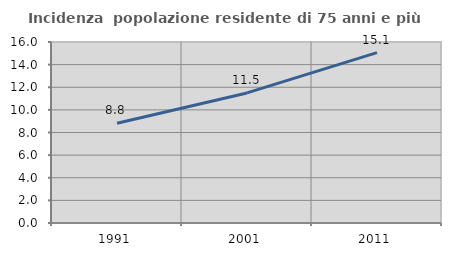
| Category | Incidenza  popolazione residente di 75 anni e più |
|---|---|
| 1991.0 | 8.818 |
| 2001.0 | 11.498 |
| 2011.0 | 15.064 |